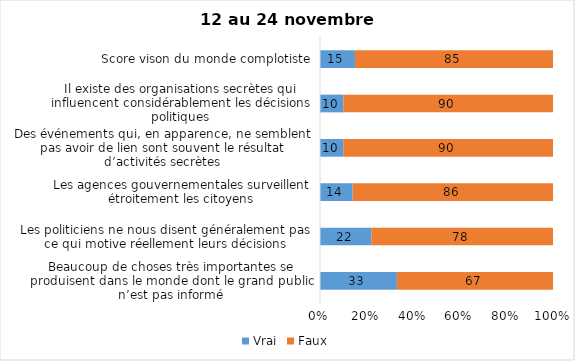
| Category | Vrai | Faux |
|---|---|---|
| Beaucoup de choses très importantes se produisent dans le monde dont le grand public n’est pas informé | 33 | 67 |
| Les politiciens ne nous disent généralement pas ce qui motive réellement leurs décisions | 22 | 78 |
| Les agences gouvernementales surveillent étroitement les citoyens | 14 | 86 |
| Des événements qui, en apparence, ne semblent pas avoir de lien sont souvent le résultat d’activités secrètes | 10 | 90 |
| Il existe des organisations secrètes qui influencent considérablement les décisions politiques | 10 | 90 |
| Score vison du monde complotiste | 15 | 85 |